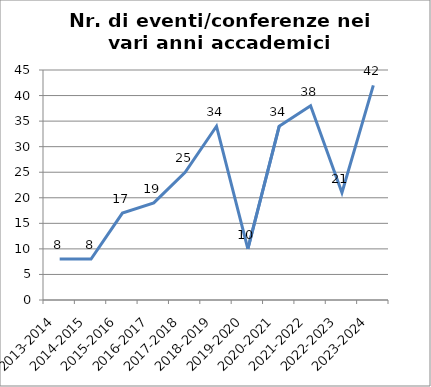
| Category | Nr. Eventi/Conferenze |
|---|---|
| 2013-2014 | 8 |
| 2014-2015 | 8 |
| 2015-2016 | 17 |
| 2016-2017 | 19 |
| 2017-2018 | 25 |
| 2018-2019 | 34 |
| 2019-2020 | 10 |
| 2020-2021 | 34 |
| 2021-2022 | 38 |
| 2022-2023 | 21 |
| 2023-2024 | 42 |